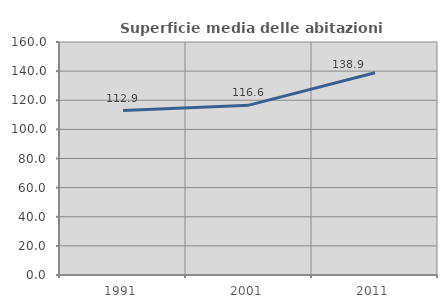
| Category | Superficie media delle abitazioni occupate |
|---|---|
| 1991.0 | 112.895 |
| 2001.0 | 116.636 |
| 2011.0 | 138.903 |